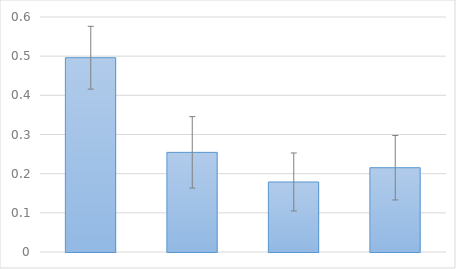
| Category | Series 0 |
|---|---|
| 0 | 0.496 |
| 1 | 0.254 |
| 2 | 0.179 |
| 3 | 0.215 |